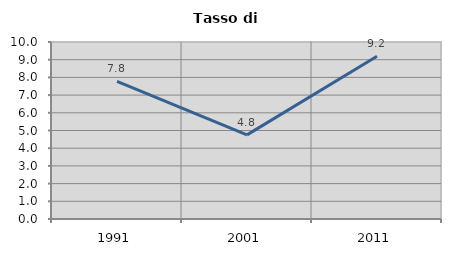
| Category | Tasso di disoccupazione   |
|---|---|
| 1991.0 | 7.775 |
| 2001.0 | 4.752 |
| 2011.0 | 9.19 |